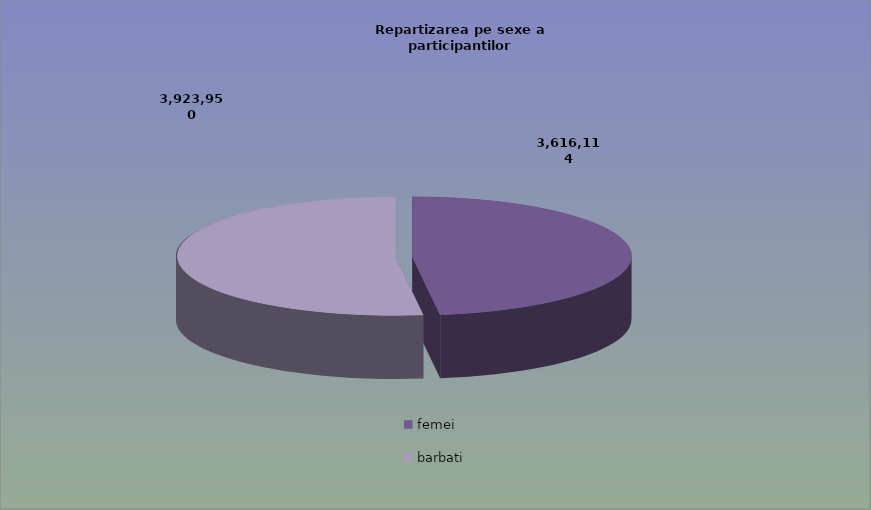
| Category | Series 0 |
|---|---|
| femei | 3616114 |
| barbati | 3923950 |